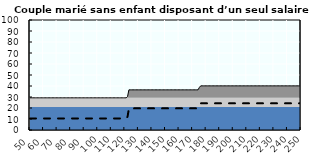
| Category | Coin fiscal marginal (somme des composantes) | Taux d’imposition marginal net |
|---|---|---|
| 50.0 | 29.249 | 10.5 |
| 51.0 | 29.249 | 10.5 |
| 52.0 | 29.249 | 10.5 |
| 53.0 | 29.249 | 10.5 |
| 54.0 | 29.249 | 10.5 |
| 55.0 | 29.249 | 10.5 |
| 56.0 | 29.249 | 10.5 |
| 57.0 | 29.249 | 10.5 |
| 58.0 | 29.249 | 10.5 |
| 59.0 | 29.249 | 10.5 |
| 60.0 | 29.249 | 10.5 |
| 61.0 | 29.249 | 10.5 |
| 62.0 | 29.249 | 10.5 |
| 63.0 | 29.249 | 10.5 |
| 64.0 | 29.249 | 10.5 |
| 65.0 | 29.249 | 10.5 |
| 66.0 | 29.249 | 10.5 |
| 67.0 | 29.249 | 10.5 |
| 68.0 | 29.249 | 10.5 |
| 69.0 | 29.249 | 10.5 |
| 70.0 | 29.249 | 10.5 |
| 71.0 | 29.249 | 10.5 |
| 72.0 | 29.249 | 10.5 |
| 73.0 | 29.249 | 10.5 |
| 74.0 | 29.249 | 10.5 |
| 75.0 | 29.249 | 10.5 |
| 76.0 | 29.249 | 10.5 |
| 77.0 | 29.249 | 10.5 |
| 78.0 | 29.249 | 10.5 |
| 79.0 | 29.249 | 10.5 |
| 80.0 | 29.249 | 10.5 |
| 81.0 | 29.249 | 10.5 |
| 82.0 | 29.249 | 10.5 |
| 83.0 | 29.249 | 10.5 |
| 84.0 | 29.249 | 10.5 |
| 85.0 | 29.249 | 10.5 |
| 86.0 | 29.249 | 10.5 |
| 87.0 | 29.249 | 10.5 |
| 88.0 | 29.249 | 10.5 |
| 89.0 | 29.249 | 10.5 |
| 90.0 | 29.249 | 10.5 |
| 91.0 | 29.249 | 10.5 |
| 92.0 | 29.249 | 10.5 |
| 93.0 | 29.249 | 10.5 |
| 94.0 | 29.249 | 10.5 |
| 95.0 | 29.249 | 10.5 |
| 96.0 | 29.249 | 10.5 |
| 97.0 | 29.249 | 10.5 |
| 98.0 | 29.249 | 10.5 |
| 99.0 | 29.249 | 10.5 |
| 100.0 | 29.249 | 10.5 |
| 101.0 | 29.249 | 10.5 |
| 102.0 | 29.249 | 10.5 |
| 103.0 | 29.249 | 10.5 |
| 104.0 | 29.249 | 10.5 |
| 105.0 | 29.249 | 10.5 |
| 106.0 | 29.249 | 10.5 |
| 107.0 | 29.249 | 10.5 |
| 108.0 | 29.249 | 10.5 |
| 109.0 | 29.249 | 10.5 |
| 110.0 | 29.249 | 10.5 |
| 111.0 | 29.249 | 10.5 |
| 112.0 | 29.249 | 10.5 |
| 113.0 | 29.249 | 10.5 |
| 114.0 | 29.249 | 10.5 |
| 115.0 | 29.249 | 10.5 |
| 116.0 | 29.249 | 10.5 |
| 117.0 | 29.249 | 10.5 |
| 118.0 | 29.249 | 10.5 |
| 119.0 | 29.249 | 10.5 |
| 120.0 | 29.249 | 10.5 |
| 121.0 | 29.249 | 10.5 |
| 122.0 | 30.51 | 12.095 |
| 123.0 | 36.504 | 19.678 |
| 124.0 | 36.504 | 19.678 |
| 125.0 | 36.504 | 19.678 |
| 126.0 | 36.504 | 19.678 |
| 127.0 | 36.504 | 19.678 |
| 128.0 | 36.504 | 19.678 |
| 129.0 | 36.504 | 19.678 |
| 130.0 | 36.504 | 19.678 |
| 131.0 | 36.504 | 19.678 |
| 132.0 | 36.504 | 19.678 |
| 133.0 | 36.504 | 19.678 |
| 134.0 | 36.504 | 19.678 |
| 135.0 | 36.504 | 19.678 |
| 136.0 | 36.504 | 19.678 |
| 137.0 | 36.504 | 19.678 |
| 138.0 | 36.504 | 19.678 |
| 139.0 | 36.504 | 19.678 |
| 140.0 | 36.504 | 19.678 |
| 141.0 | 36.504 | 19.678 |
| 142.0 | 36.504 | 19.678 |
| 143.0 | 36.504 | 19.678 |
| 144.0 | 36.504 | 19.678 |
| 145.0 | 36.504 | 19.678 |
| 146.0 | 36.504 | 19.678 |
| 147.0 | 36.504 | 19.678 |
| 148.0 | 36.504 | 19.678 |
| 149.0 | 36.504 | 19.678 |
| 150.0 | 36.504 | 19.678 |
| 151.0 | 36.504 | 19.678 |
| 152.0 | 36.504 | 19.678 |
| 153.0 | 36.504 | 19.678 |
| 154.0 | 36.504 | 19.678 |
| 155.0 | 36.504 | 19.678 |
| 156.0 | 36.504 | 19.678 |
| 157.0 | 36.504 | 19.678 |
| 158.0 | 36.504 | 19.678 |
| 159.0 | 36.504 | 19.678 |
| 160.0 | 36.504 | 19.678 |
| 161.0 | 36.504 | 19.678 |
| 162.0 | 36.504 | 19.678 |
| 163.0 | 36.504 | 19.678 |
| 164.0 | 36.504 | 19.678 |
| 165.0 | 36.504 | 19.678 |
| 166.0 | 36.504 | 19.678 |
| 167.0 | 36.504 | 19.678 |
| 168.0 | 36.504 | 19.678 |
| 169.0 | 36.504 | 19.678 |
| 170.0 | 36.504 | 19.678 |
| 171.0 | 36.504 | 19.678 |
| 172.0 | 36.504 | 19.678 |
| 173.0 | 36.504 | 19.678 |
| 174.0 | 36.504 | 19.678 |
| 175.0 | 38.729 | 22.492 |
| 176.0 | 40.132 | 24.267 |
| 177.0 | 40.132 | 24.267 |
| 178.0 | 40.132 | 24.267 |
| 179.0 | 40.132 | 24.267 |
| 180.0 | 40.132 | 24.267 |
| 181.0 | 40.132 | 24.267 |
| 182.0 | 40.132 | 24.267 |
| 183.0 | 40.132 | 24.267 |
| 184.0 | 40.132 | 24.267 |
| 185.0 | 40.132 | 24.267 |
| 186.0 | 40.132 | 24.267 |
| 187.0 | 40.132 | 24.267 |
| 188.0 | 40.132 | 24.267 |
| 189.0 | 40.132 | 24.267 |
| 190.0 | 40.132 | 24.267 |
| 191.0 | 40.132 | 24.267 |
| 192.0 | 40.132 | 24.267 |
| 193.0 | 40.132 | 24.267 |
| 194.0 | 40.132 | 24.267 |
| 195.0 | 40.132 | 24.267 |
| 196.0 | 40.132 | 24.267 |
| 197.0 | 40.132 | 24.267 |
| 198.0 | 40.132 | 24.267 |
| 199.0 | 40.132 | 24.267 |
| 200.0 | 40.132 | 24.267 |
| 201.0 | 40.132 | 24.267 |
| 202.0 | 40.132 | 24.267 |
| 203.0 | 40.132 | 24.267 |
| 204.0 | 40.132 | 24.267 |
| 205.0 | 40.132 | 24.267 |
| 206.0 | 40.132 | 24.267 |
| 207.0 | 40.132 | 24.267 |
| 208.0 | 40.132 | 24.267 |
| 209.0 | 40.132 | 24.267 |
| 210.0 | 40.132 | 24.267 |
| 211.0 | 40.132 | 24.267 |
| 212.0 | 40.132 | 24.267 |
| 213.0 | 40.132 | 24.267 |
| 214.0 | 40.132 | 24.267 |
| 215.0 | 40.132 | 24.267 |
| 216.0 | 40.132 | 24.267 |
| 217.0 | 40.132 | 24.267 |
| 218.0 | 40.132 | 24.267 |
| 219.0 | 40.132 | 24.267 |
| 220.0 | 40.132 | 24.267 |
| 221.0 | 40.132 | 24.267 |
| 222.0 | 40.132 | 24.267 |
| 223.0 | 40.132 | 24.267 |
| 224.0 | 40.132 | 24.267 |
| 225.0 | 40.132 | 24.267 |
| 226.0 | 40.132 | 24.267 |
| 227.0 | 40.132 | 24.267 |
| 228.0 | 40.132 | 24.267 |
| 229.0 | 40.132 | 24.267 |
| 230.0 | 40.132 | 24.267 |
| 231.0 | 40.132 | 24.267 |
| 232.0 | 40.132 | 24.267 |
| 233.0 | 40.132 | 24.267 |
| 234.0 | 40.132 | 24.267 |
| 235.0 | 40.132 | 24.267 |
| 236.0 | 40.132 | 24.267 |
| 237.0 | 40.132 | 24.267 |
| 238.0 | 40.132 | 24.267 |
| 239.0 | 40.132 | 24.267 |
| 240.0 | 40.132 | 24.267 |
| 241.0 | 40.132 | 24.267 |
| 242.0 | 40.132 | 24.267 |
| 243.0 | 40.132 | 24.267 |
| 244.0 | 40.132 | 24.267 |
| 245.0 | 40.132 | 24.267 |
| 246.0 | 40.132 | 24.267 |
| 247.0 | 40.132 | 24.267 |
| 248.0 | 40.132 | 24.267 |
| 249.0 | 40.132 | 24.267 |
| 250.0 | 40.132 | 24.267 |